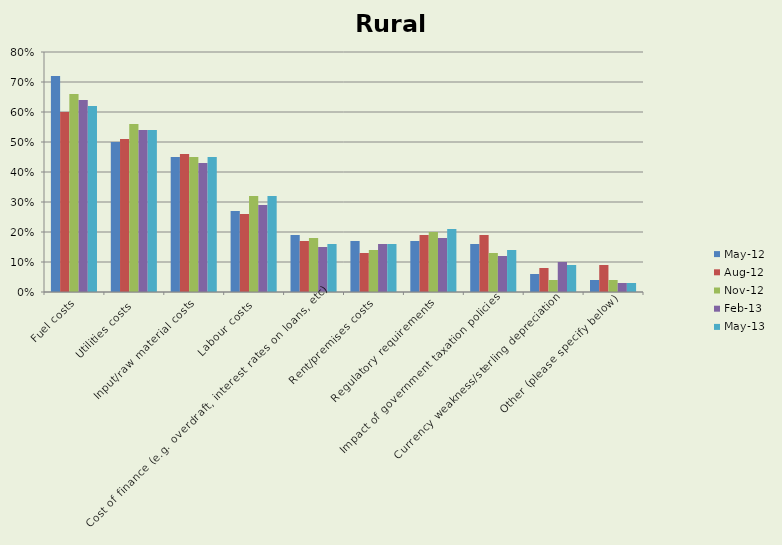
| Category | May-12 | Aug-12 | Nov-12 | Feb-13 | May-13 |
|---|---|---|---|---|---|
| Fuel costs | 0.72 | 0.6 | 0.66 | 0.64 | 0.62 |
| Utilities costs | 0.5 | 0.51 | 0.56 | 0.54 | 0.54 |
| Input/raw material costs | 0.45 | 0.46 | 0.45 | 0.43 | 0.45 |
| Labour costs | 0.27 | 0.26 | 0.32 | 0.29 | 0.32 |
| Cost of finance (e.g. overdraft, interest rates on loans, etc) | 0.19 | 0.17 | 0.18 | 0.15 | 0.16 |
| Rent/premises costs | 0.17 | 0.13 | 0.14 | 0.16 | 0.16 |
| Regulatory requirements | 0.17 | 0.19 | 0.2 | 0.18 | 0.21 |
| Impact of government taxation policies | 0.16 | 0.19 | 0.13 | 0.12 | 0.14 |
| Currency weakness/sterling depreciation | 0.06 | 0.08 | 0.04 | 0.1 | 0.09 |
| Other (please specify below) | 0.04 | 0.09 | 0.04 | 0.03 | 0.03 |